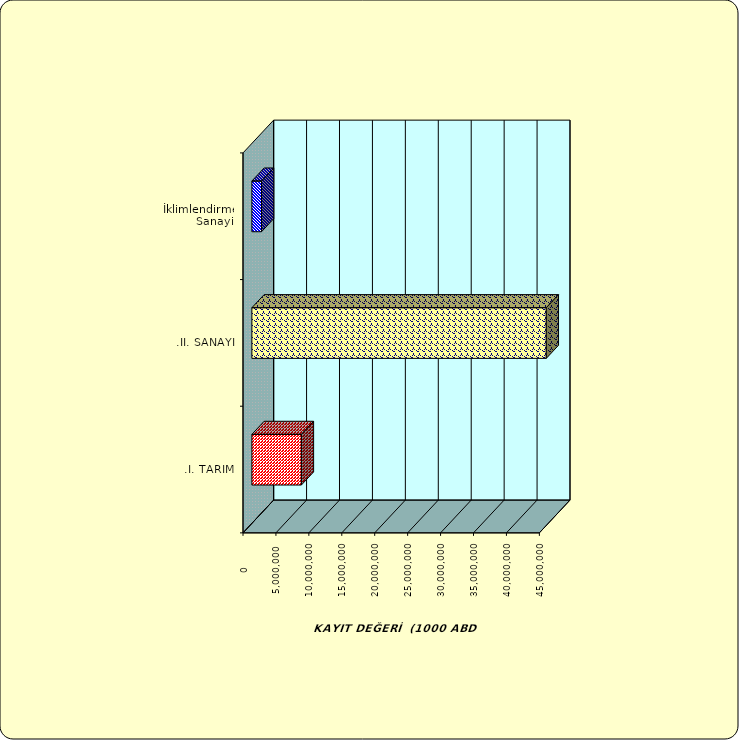
| Category | Series 0 |
|---|---|
| .I. TARIM | 7515705.088 |
| .II. SANAYİ | 44703232.913 |
|  İklimlendirme Sanayii | 1466652.976 |